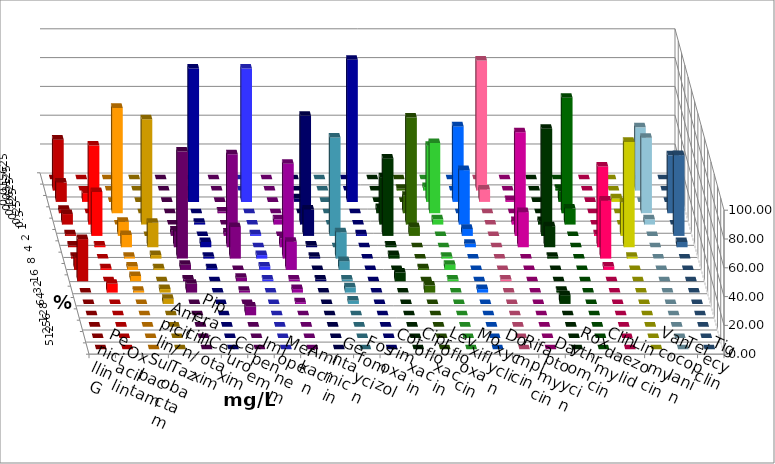
| Category | Penicillin G | Oxacillin | Ampicillin/ Sulbactam | Piperacillin/ Tazobactam | Cefotaxim | Cefuroxim | Imipenem | Meropenem | Amikacin | Gentamicin | Fosfomycin | Cotrimoxazol | Ciprofloxacin | Levofloxacin | Moxifloxacin | Doxycyclin | Rifampicin | Daptomycin | Roxythromycin | Clindamycin | Linezolid | Vancomycin | Teicoplanin | Tigecyclin |
|---|---|---|---|---|---|---|---|---|---|---|---|---|---|---|---|---|---|---|---|---|---|---|---|---|
| 0.015625 | 0 | 0 | 0 | 0 | 0 | 0 | 0 | 0 | 0 | 0 | 0 | 0 | 0 | 0 | 0 | 0 | 0 | 0 | 0 | 0 | 0 | 0 | 0 | 0 |
| 0.03125 | 35.366 | 0 | 0 | 0 | 0 | 0 | 0 | 0 | 0 | 0 | 0 | 0 | 0 | 1.22 | 2.439 | 0 | 90.244 | 0 | 0 | 1.235 | 0 | 0 | 0 | 43.902 |
| 0.0625 | 13.415 | 6.098 | 0 | 0 | 0 | 0 | 92.683 | 92.683 | 0 | 2.439 | 0 | 98.78 | 0 | 0 | 39.024 | 52.439 | 8.537 | 1.22 | 0 | 7.407 | 0 | 2.439 | 0 | 0 |
| 0.125 | 2.439 | 0 | 73.171 | 0 | 0 | 1.22 | 0 | 0 | 0 | 0 | 0 | 0 | 3.659 | 12.195 | 48.78 | 0 | 0 | 0 | 0 | 80.247 | 0 | 0 | 40.244 | 52.439 |
| 0.25 | 7.317 | 54.878 | 0 | 73.171 | 0 | 0 | 1.22 | 0 | 3.659 | 75.61 | 0 | 0 | 32.927 | 74.39 | 3.659 | 37.805 | 0 | 2.439 | 2.439 | 11.111 | 0 | 0 | 0 | 3.659 |
| 0.5 | 1.22 | 30.488 | 9.756 | 0 | 3.659 | 2.439 | 0 | 1.22 | 0 | 18.293 | 68.293 | 1.22 | 53.659 | 6.098 | 0 | 4.878 | 0 | 71.951 | 74.39 | 0 | 1.22 | 23.171 | 56.098 | 0 |
| 1.0 | 1.22 | 1.22 | 8.537 | 17.073 | 10.976 | 64.634 | 3.659 | 0 | 6.098 | 1.22 | 0 | 0 | 1.22 | 0 | 0 | 2.439 | 0 | 24.39 | 14.634 | 0 | 56.098 | 73.171 | 3.659 | 0 |
| 2.0 | 1.22 | 0 | 1.22 | 2.439 | 74.39 | 21.951 | 1.22 | 2.439 | 65.854 | 1.22 | 18.293 | 0 | 2.439 | 0 | 1.22 | 0 | 0 | 0 | 1.22 | 0 | 40.244 | 1.22 | 0 | 0 |
| 4.0 | 8.537 | 1.22 | 2.439 | 1.22 | 3.659 | 0 | 1.22 | 2.439 | 19.512 | 0 | 6.098 | 0 | 0 | 1.22 | 3.659 | 0 | 0 | 0 | 0 | 0 | 2.439 | 0 | 0 | 0 |
| 8.0 | 29.268 | 0 | 3.659 | 0 | 1.22 | 2.439 | 0 | 1.22 | 1.22 | 1.22 | 1.22 | 0 | 6.098 | 0 | 1.22 | 0 | 1.22 | 0 | 0 | 0 | 0 | 0 | 0 | 0 |
| 16.0 | 0 | 6.098 | 1.22 | 2.439 | 6.098 | 1.22 | 0 | 0 | 2.439 | 0 | 3.659 | 0 | 0 | 4.878 | 0 | 2.439 | 0 | 0 | 1.22 | 0 | 0 | 0 | 0 | 0 |
| 32.0 | 0 | 0 | 0 | 3.659 | 0 | 0 | 0 | 0 | 1.22 | 0 | 2.439 | 0 | 0 | 0 | 0 | 0 | 0 | 0 | 6.098 | 0 | 0 | 0 | 0 | 0 |
| 64.0 | 0 | 0 | 0 | 0 | 0 | 6.098 | 0 | 0 | 0 | 0 | 0 | 0 | 0 | 0 | 0 | 0 | 0 | 0 | 0 | 0 | 0 | 0 | 0 | 0 |
| 128.0 | 0 | 0 | 0 | 0 | 0 | 0 | 0 | 0 | 0 | 0 | 0 | 0 | 0 | 0 | 0 | 0 | 0 | 0 | 0 | 0 | 0 | 0 | 0 | 0 |
| 256.0 | 0 | 0 | 0 | 0 | 0 | 0 | 0 | 0 | 0 | 0 | 0 | 0 | 0 | 0 | 0 | 0 | 0 | 0 | 0 | 0 | 0 | 0 | 0 | 0 |
| 512.0 | 0 | 0 | 0 | 0 | 0 | 0 | 0 | 0 | 0 | 0 | 0 | 0 | 0 | 0 | 0 | 0 | 0 | 0 | 0 | 0 | 0 | 0 | 0 | 0 |